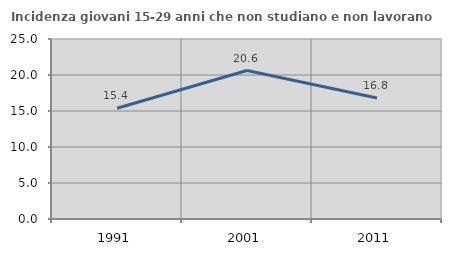
| Category | Incidenza giovani 15-29 anni che non studiano e non lavorano  |
|---|---|
| 1991.0 | 15.385 |
| 2001.0 | 20.619 |
| 2011.0 | 16.811 |